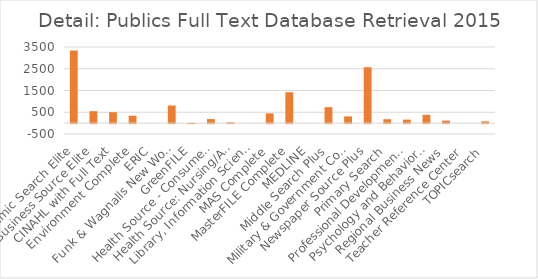
| Category | Publics |
|---|---|
| Academic Search Elite | 3338 |
| Business Source Elite | 548 |
| CINAHL with Full Text | 503 |
| Environment Complete | 340 |
| ERIC | 0 |
| Funk & Wagnalls New World Encyclopedia | 809 |
| GreenFILE | 10 |
| Health Source - Consumer Edition | 186 |
| Health Source: Nursing/Academic Edition | 31 |
| Library, Information Science & Technology Abstracts | 0 |
| MAS Complete | 449 |
| MasterFILE Complete | 1420 |
| MEDLINE | 0 |
| Middle Search Plus | 733 |
| Military & Government Collection | 309 |
| Newspaper Source Plus | 2570 |
| Primary Search | 179 |
| Professional Development Collection | 161 |
| Psychology and Behavioral Sciences Collection | 384 |
| Regional Business News | 116 |
| Teacher Reference Center | 0 |
| TOPICsearch | 81 |